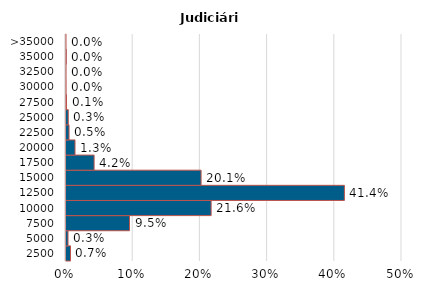
| Category | Judiciário |
|---|---|
| 2500 | 0.007 |
| 5000 | 0.003 |
| 7500 | 0.095 |
| 10000 | 0.216 |
| 12500 | 0.414 |
| 15000 | 0.201 |
| 17500 | 0.042 |
| 20000 | 0.013 |
| 22500 | 0.005 |
| 25000 | 0.003 |
| 27500 | 0.001 |
| 30000 | 0 |
| 32500 | 0 |
| 35000 | 0 |
| >35000 | 0 |